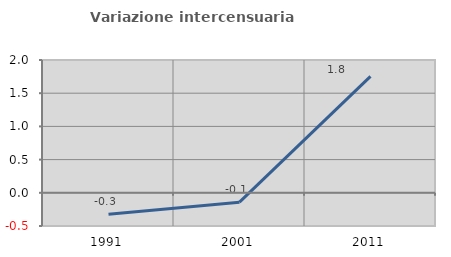
| Category | Variazione intercensuaria annua |
|---|---|
| 1991.0 | -0.324 |
| 2001.0 | -0.142 |
| 2011.0 | 1.754 |